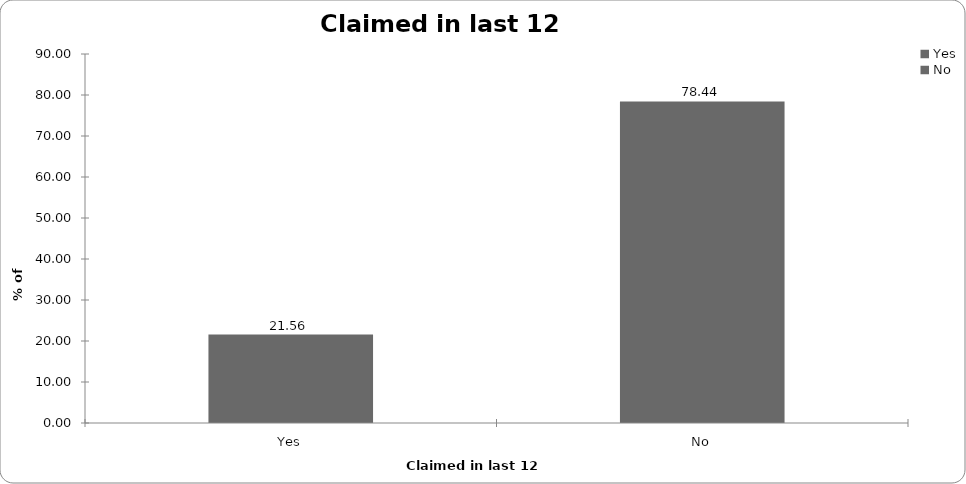
| Category | Claimed in last 12 months |
|---|---|
| Yes | 21.562 |
| No | 78.438 |